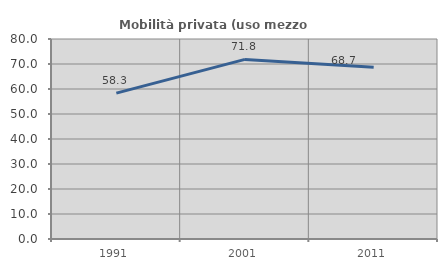
| Category | Mobilità privata (uso mezzo privato) |
|---|---|
| 1991.0 | 58.336 |
| 2001.0 | 71.848 |
| 2011.0 | 68.723 |